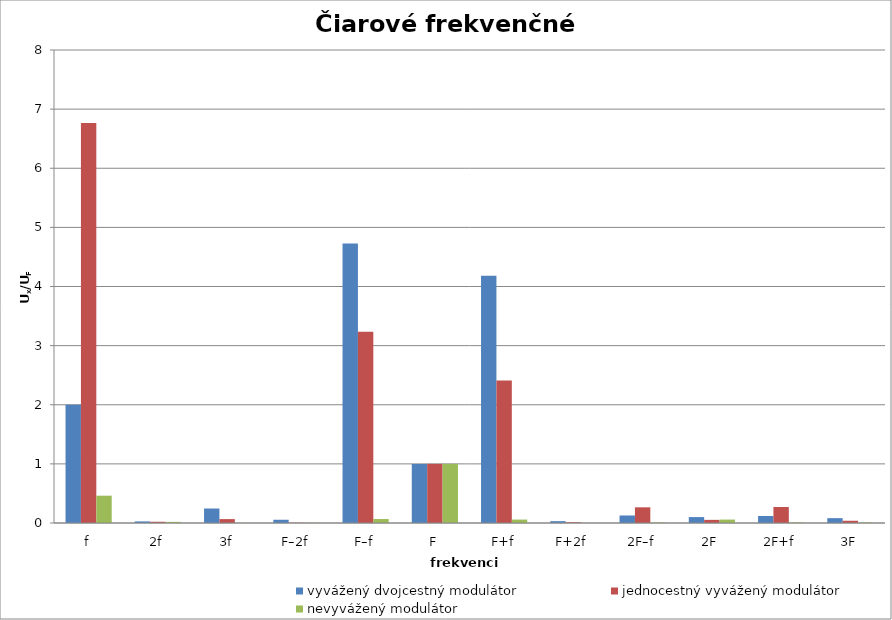
| Category | vyvážený dvojcestný modulátor | jednocestný vyvážený modulátor | nevyvážený modulátor |
|---|---|---|---|
| f | 2 | 6.765 | 0.462 |
| 2f | 0.027 | 0.021 | 0.019 |
| 3f | 0.245 | 0.066 | 0.002 |
| F–2f | 0.055 | 0.004 | 0.003 |
| F–f | 4.727 | 3.235 | 0.067 |
| F | 1 | 1 | 1 |
| F+f | 4.182 | 2.412 | 0.058 |
| F+2f | 0.031 | 0.012 | 0.001 |
| 2F–f | 0.127 | 0.265 | 0.009 |
| 2F | 0.1 | 0.053 | 0.058 |
| 2F+f | 0.118 | 0.271 | 0.008 |
| 3F | 0.082 | 0.038 | 0.008 |